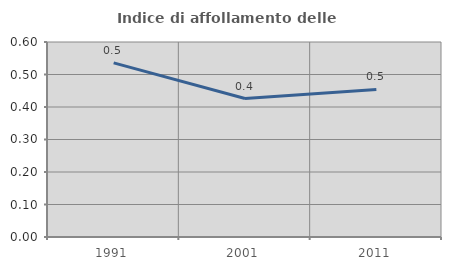
| Category | Indice di affollamento delle abitazioni  |
|---|---|
| 1991.0 | 0.536 |
| 2001.0 | 0.426 |
| 2011.0 | 0.454 |